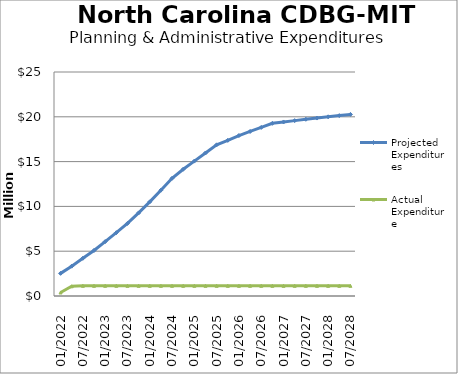
| Category | Projected Expenditures | Actual Expenditure |
|---|---|---|
| 01/2022 | 2525940.542 | 393251.51 |
| 04/2022 | 3331348.257 | 1084981.7 |
| 07/2022 | 4208625.807 | 1134493.33 |
| 10/2022 | 5085903.358 | 1134493.33 |
| 01/2023 | 6072876.974 | 1134493.33 |
| 04/2023 | 7064680.709 | 1134493.33 |
| 07/2023 | 8097336.771 | 1134493.33 |
| 10/2023 | 9272975.98 | 1134493.33 |
| 01/2024 | 10509893.681 | 1134493.33 |
| 04/2024 | 11808089.874 | 1134493.33 |
| 07/2024 | 13138060.099 | 1134493.33 |
| 10/2024 | 14148020.424 | 1134493.33 |
| 01/2025 | 15055849.929 | 1134493.33 |
| 04/2025 | 15962947.929 | 1134493.33 |
| 07/2025 | 16870045.929 | 1134493.33 |
| 10/2025 | 17372377.897 | 1134493.33 |
| 01/2026 | 17909708.292 | 1134493.33 |
| 04/2026 | 18363257.292 | 1134493.33 |
| 07/2026 | 18816806.292 | 1134493.33 |
| 10/2026 | 19270355.292 | 1134493.33 |
| 01/2027 | 19421537.292 | 1134493.33 |
| 04/2027 | 19572720.292 | 1134493.33 |
| 07/2027 | 19723902.292 | 1134493.33 |
| 10/2027 | 19860076.717 | 1134493.33 |
| 01/2028 | 19996251.143 | 1134493.33 |
| 04/2028 | 20132425.569 | 1134493.33 |
| 07/2028 | 20268599.995 | 1134493.33 |